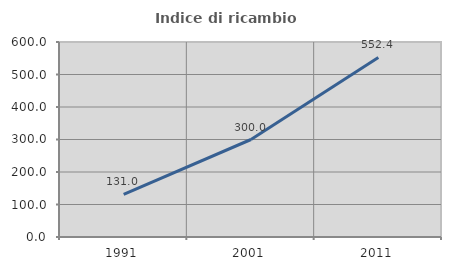
| Category | Indice di ricambio occupazionale  |
|---|---|
| 1991.0 | 130.952 |
| 2001.0 | 300 |
| 2011.0 | 552.381 |